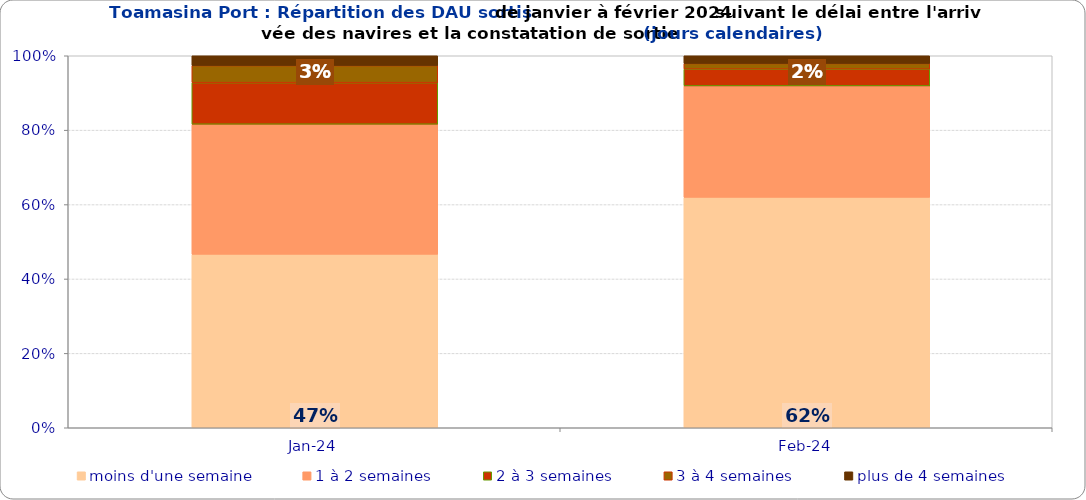
| Category | moins d'une semaine | 1 à 2 semaines | 2 à 3 semaines | 3 à 4 semaines | plus de 4 semaines |
|---|---|---|---|---|---|
| 2024-01-01 | 0.466 | 0.35 | 0.112 | 0.046 | 0.026 |
| 2024-02-01 | 0.619 | 0.3 | 0.045 | 0.015 | 0.021 |